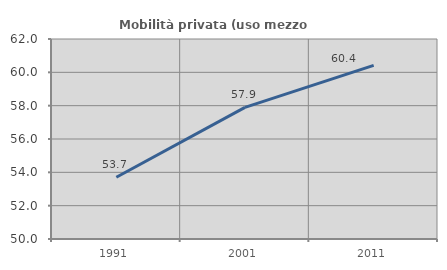
| Category | Mobilità privata (uso mezzo privato) |
|---|---|
| 1991.0 | 53.704 |
| 2001.0 | 57.895 |
| 2011.0 | 60.417 |